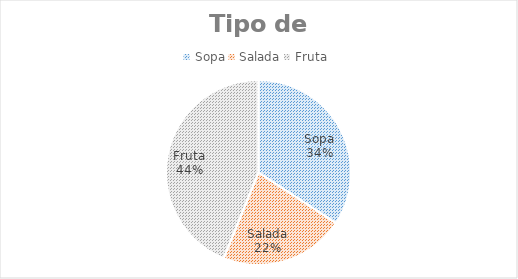
| Category | Alunos |
|---|---|
| Sopa | 39 |
| Salada | 25 |
| Fruta | 50 |